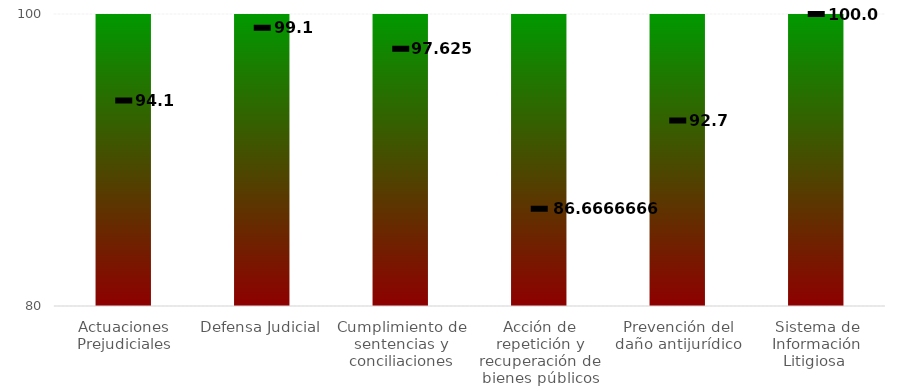
| Category | Rangos |
|---|---|
| Actuaciones Prejudiciales | 100 |
| Defensa Judicial | 100 |
| Cumplimiento de sentencias y conciliaciones | 100 |
| Acción de repetición y recuperación de bienes públicos | 100 |
| Prevención del daño antijurídico | 100 |
| Sistema de Información Litigiosa  | 100 |